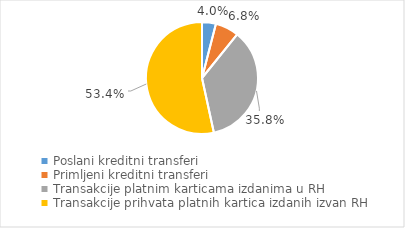
| Category | Series 0 |
|---|---|
| Poslani kreditni transferi | 4080576 |
| Primljeni kreditni transferi | 6918035 |
| Transakcije platnim karticama izdanima u RH | 36412495 |
| Transakcije prihvata platnih kartica izdanih izvan RH | 54354532 |